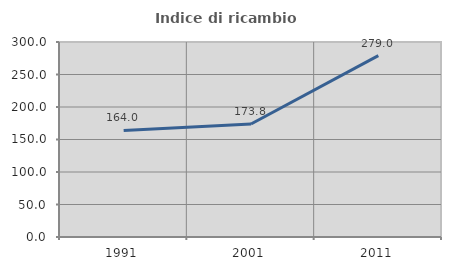
| Category | Indice di ricambio occupazionale  |
|---|---|
| 1991.0 | 164 |
| 2001.0 | 173.786 |
| 2011.0 | 279.032 |